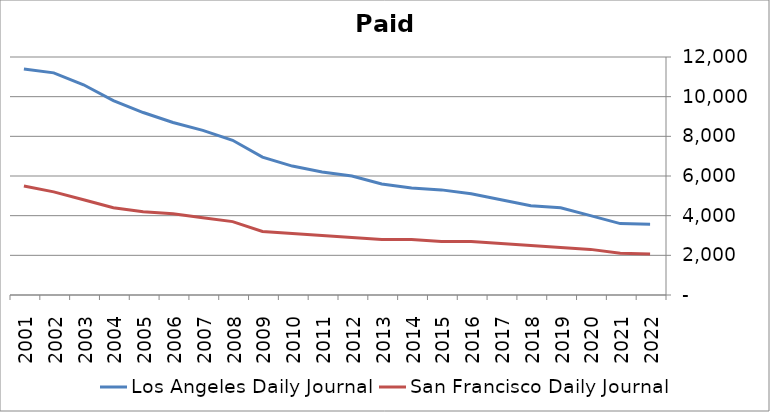
| Category | Los Angeles Daily Journal | San Francisco Daily Journal |
|---|---|---|
| 2022.0 | 3570 | 2070 |
| 2021.0 | 3600 | 2100 |
| 2020.0 | 4000 | 2300 |
| 2019.0 | 4400 | 2400 |
| 2018.0 | 4500 | 2500 |
| 2017.0 | 4800 | 2600 |
| 2016.0 | 5100 | 2700 |
| 2015.0 | 5300 | 2700 |
| 2014.0 | 5400 | 2800 |
| 2013.0 | 5600 | 2800 |
| 2012.0 | 6000 | 2900 |
| 2011.0 | 6200 | 3000 |
| 2010.0 | 6500 | 3100 |
| 2009.0 | 6950 | 3200 |
| 2008.0 | 7800 | 3700 |
| 2007.0 | 8300 | 3900 |
| 2006.0 | 8700 | 4100 |
| 2005.0 | 9200 | 4200 |
| 2004.0 | 9800 | 4400 |
| 2003.0 | 10600 | 4800 |
| 2002.0 | 11200 | 5200 |
| 2001.0 | 11400 | 5500 |